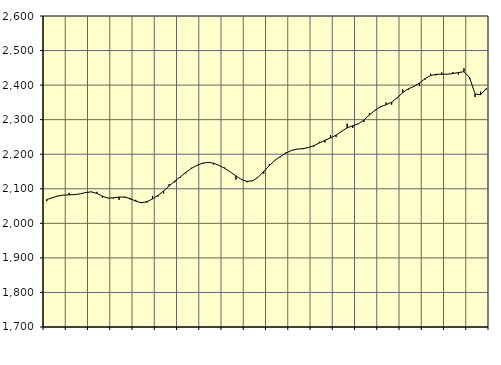
| Category | Piggar | Series 1 |
|---|---|---|
| nan | 2064.2 | 2068.97 |
| 1.0 | 2075.7 | 2074.08 |
| 1.0 | 2080.1 | 2079.1 |
| 1.0 | 2081.3 | 2081.82 |
| nan | 2088 | 2082.37 |
| 2.0 | 2081.6 | 2083.22 |
| 2.0 | 2085.2 | 2085.21 |
| 2.0 | 2087.8 | 2089.26 |
| nan | 2092.3 | 2090.95 |
| 3.0 | 2091.2 | 2086.73 |
| 3.0 | 2074.5 | 2078.58 |
| 3.0 | 2073.4 | 2072.97 |
| nan | 2071.7 | 2073.81 |
| 4.0 | 2067.8 | 2076.16 |
| 4.0 | 2077.8 | 2075.81 |
| 4.0 | 2069 | 2071.62 |
| nan | 2068.1 | 2064.11 |
| 5.0 | 2061.7 | 2059.54 |
| 5.0 | 2059.4 | 2062.64 |
| 5.0 | 2079.5 | 2070.58 |
| nan | 2077.3 | 2080.96 |
| 6.0 | 2086.3 | 2093.64 |
| 6.0 | 2113.9 | 2108.18 |
| 6.0 | 2118.3 | 2122.1 |
| nan | 2132.4 | 2134.39 |
| 7.0 | 2144.9 | 2147.58 |
| 7.0 | 2160.8 | 2158.97 |
| 7.0 | 2166.4 | 2167.66 |
| nan | 2171.9 | 2174.01 |
| 8.0 | 2176.8 | 2176.4 |
| 8.0 | 2170.3 | 2174.03 |
| 8.0 | 2168.4 | 2167.47 |
| nan | 2161.4 | 2159.15 |
| 9.0 | 2148.3 | 2148.66 |
| 9.0 | 2126.1 | 2137.26 |
| 9.0 | 2128 | 2126.98 |
| nan | 2118.7 | 2121.29 |
| 10.0 | 2124.3 | 2123.04 |
| 10.0 | 2133.9 | 2133.37 |
| 10.0 | 2143.7 | 2149.94 |
| nan | 2171.2 | 2167.47 |
| 11.0 | 2181.9 | 2182.09 |
| 11.0 | 2191.3 | 2193.44 |
| 11.0 | 2205.3 | 2203.34 |
| nan | 2210 | 2211.07 |
| 12.0 | 2214.2 | 2214.77 |
| 12.0 | 2214.3 | 2216.24 |
| 12.0 | 2218.9 | 2219.17 |
| nan | 2221.7 | 2224.67 |
| 13.0 | 2236 | 2232.62 |
| 13.0 | 2234.1 | 2240.57 |
| 13.0 | 2255.3 | 2247.01 |
| nan | 2249.5 | 2255.44 |
| 14.0 | 2264.1 | 2266.27 |
| 14.0 | 2288.4 | 2276.27 |
| 14.0 | 2276 | 2282.32 |
| nan | 2288.4 | 2287.82 |
| 15.0 | 2292.8 | 2298.95 |
| 15.0 | 2319.3 | 2313.66 |
| 15.0 | 2325.9 | 2327.27 |
| nan | 2336.1 | 2337.4 |
| 16.0 | 2349.9 | 2343.07 |
| 16.0 | 2343.4 | 2350.73 |
| 16.0 | 2361.6 | 2363.66 |
| nan | 2387.8 | 2378.41 |
| 17.0 | 2386.1 | 2389.3 |
| 17.0 | 2395.3 | 2396.2 |
| 17.0 | 2398.4 | 2406 |
| nan | 2416.1 | 2418.62 |
| 18.0 | 2433.2 | 2427.72 |
| 18.0 | 2428.1 | 2431.26 |
| 18.0 | 2436.7 | 2431.37 |
| nan | 2432.1 | 2431.65 |
| 19.0 | 2437.6 | 2433.51 |
| 19.0 | 2430.6 | 2436.32 |
| 19.0 | 2448.8 | 2438.8 |
| nan | 2417.9 | 2422.14 |
| 20.0 | 2365.5 | 2374.32 |
| 20.0 | 2381.5 | 2372.24 |
| 20.0 | 2387.3 | 2390.15 |